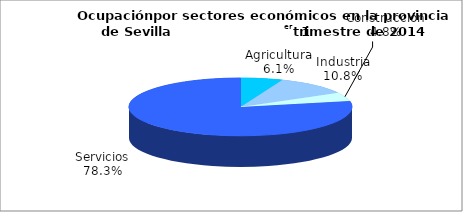
| Category | Series 0 |
|---|---|
| Agricultura | 37.5 |
| Industria | 66.4 |
| Construcción | 29.3 |
| Servicios | 481.2 |